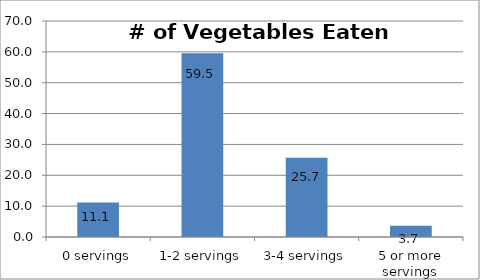
| Category | Series 0 |
|---|---|
| 0 servings | 11.143 |
| 1-2 servings | 59.509 |
| 3-4 servings | 25.696 |
| 5 or more servings | 3.652 |